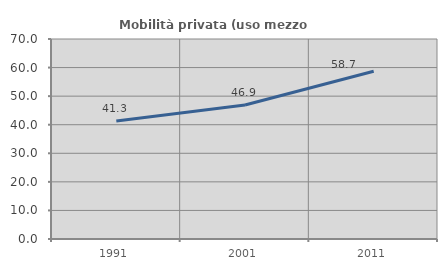
| Category | Mobilità privata (uso mezzo privato) |
|---|---|
| 1991.0 | 41.27 |
| 2001.0 | 46.919 |
| 2011.0 | 58.722 |